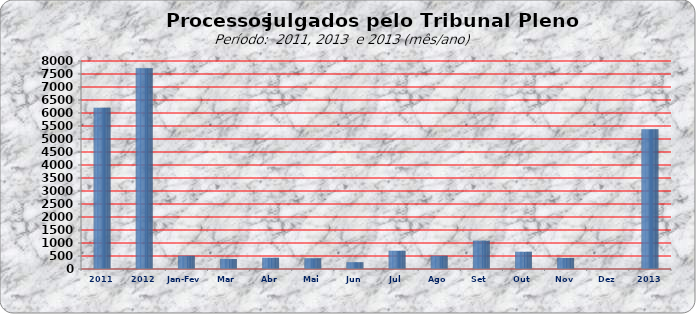
| Category | 6205 7722 509 381 429 411 264 701 508 1091 660 423 0 |
|---|---|
| 2011 | 6205 |
| 2012 | 7722 |
| Jan-Fev | 509 |
| Mar | 381 |
| Abr | 429 |
| Mai | 411 |
| Jun | 264 |
| Jul | 701 |
| Ago | 508 |
| Set | 1091 |
| Out | 660 |
| Nov | 423 |
| Dez | 0 |
| 2013 | 5377 |